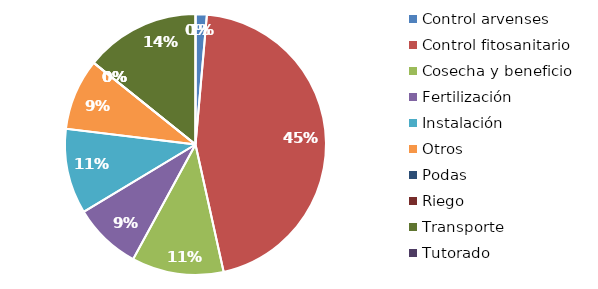
| Category | Valor |
|---|---|
| Control arvenses | 102386 |
| Control fitosanitario | 3311232 |
| Cosecha y beneficio | 835654.485 |
| Fertilización | 619852 |
| Instalación | 773754.153 |
| Otros | 648024 |
| Podas | 0 |
| Riego | 0 |
| Transporte | 1044568 |
| Tutorado | 0 |